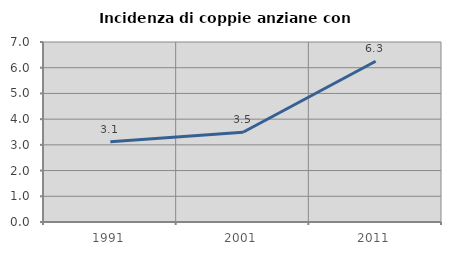
| Category | Incidenza di coppie anziane con figli |
|---|---|
| 1991.0 | 3.125 |
| 2001.0 | 3.488 |
| 2011.0 | 6.25 |